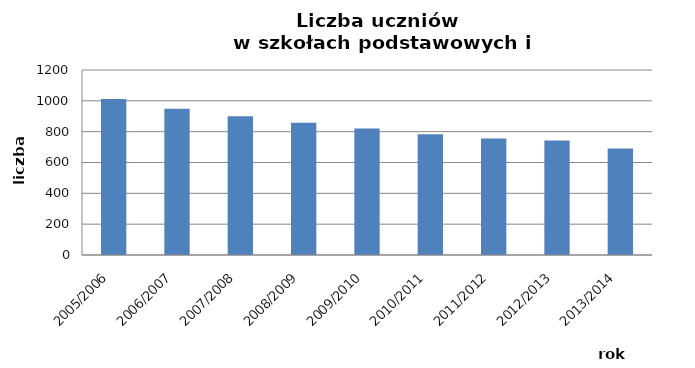
| Category | Series 0 |
|---|---|
| 2005/2006 | 1012 |
| 2006/2007 | 948 |
| 2007/2008 | 900 |
| 2008/2009 | 858 |
| 2009/2010 | 821 |
| 2010/2011 | 784 |
| 2011/2012 | 755 |
| 2012/2013 | 742 |
| 2013/2014 | 691 |